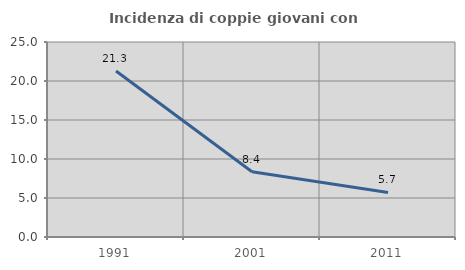
| Category | Incidenza di coppie giovani con figli |
|---|---|
| 1991.0 | 21.289 |
| 2001.0 | 8.357 |
| 2011.0 | 5.706 |